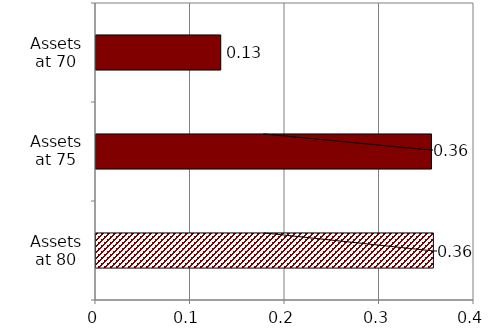
| Category | Series 0 |
|---|---|
| Assets at 80 | 0.357 |
| Assets at 75 | 0.355 |
| Assets at 70 | 0.132 |